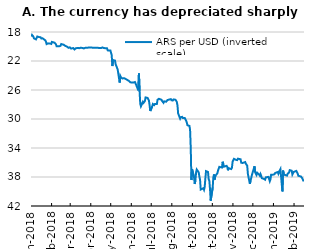
| Category | ARS per USD (inverted scale) |
|---|---|
| Jan-18 | 18.625 |
| Jan-18 | 18.4 |
| Jan-18 | 18.445 |
| Jan-18 | 18.62 |
| Jan-18 | 18.88 |
| Jan-18 | 19.02 |
| Jan-18 | 18.938 |
| Jan-18 | 18.62 |
| Jan-18 | 18.705 |
| Jan-18 | 18.685 |
| Jan-18 | 18.735 |
| Jan-18 | 18.89 |
| Jan-18 | 18.855 |
| Jan-18 | 18.871 |
| Jan-18 | 18.991 |
| Jan-18 | 19.146 |
| Jan-18 | 19.34 |
| Jan-18 | 19.661 |
| Jan-18 | 19.578 |
| Jan-18 | 19.567 |
| Jan-18 | 19.585 |
| Jan-18 | 19.632 |
| Jan-18 | 19.642 |
| Feb-18 | 19.365 |
| Feb-18 | 19.482 |
| Feb-18 | 19.475 |
| Feb-18 | 19.575 |
| Feb-18 | 19.688 |
| Feb-18 | 19.965 |
| Feb-18 | 19.97 |
| Feb-18 | 19.97 |
| Feb-18 | 19.97 |
| Feb-18 | 19.897 |
| Feb-18 | 19.66 |
| Feb-18 | 19.767 |
| Feb-18 | 19.767 |
| Feb-18 | 19.865 |
| Feb-18 | 19.912 |
| Feb-18 | 19.952 |
| Feb-18 | 19.977 |
| Feb-18 | 20.18 |
| Feb-18 | 20.23 |
| Feb-18 | 20.115 |
| Mar-18 | 20.155 |
| Mar-18 | 20.285 |
| Mar-18 | 20.21 |
| Mar-18 | 20.325 |
| Mar-18 | 20.402 |
| Mar-18 | 20.36 |
| Mar-18 | 20.245 |
| Mar-18 | 20.197 |
| Mar-18 | 20.212 |
| Mar-18 | 20.235 |
| Mar-18 | 20.33 |
| Mar-18 | 20.18 |
| Mar-18 | 20.195 |
| Mar-18 | 20.257 |
| Mar-18 | 20.269 |
| Mar-18 | 20.224 |
| Mar-18 | 20.189 |
| Mar-18 | 20.185 |
| Mar-18 | 20.169 |
| Mar-18 | 20.147 |
| Mar-18 | 20.147 |
| Mar-18 | 20.147 |
| Apr-18 | 20.147 |
| Apr-18 | 20.175 |
| Apr-18 | 20.179 |
| Apr-18 | 20.19 |
| Apr-18 | 20.17 |
| Apr-18 | 20.19 |
| Apr-18 | 20.159 |
| Apr-18 | 20.166 |
| Apr-18 | 20.207 |
| Apr-18 | 20.218 |
| Apr-18 | 20.219 |
| Apr-18 | 20.177 |
| Apr-18 | 20.13 |
| Apr-18 | 20.165 |
| Apr-18 | 20.2 |
| Apr-18 | 20.259 |
| Apr-18 | 20.259 |
| Apr-18 | 20.257 |
| Apr-18 | 20.535 |
| Apr-18 | 20.537 |
| Apr-18 | 20.537 |
| May-18 | 20.537 |
| May-18 | 21.185 |
| May-18 | 22.7 |
| May-18 | 21.865 |
| May-18 | 21.95 |
| May-18 | 22.475 |
| May-18 | 22.7 |
| May-18 | 22.7 |
| May-18 | 23.175 |
| May-18 | 24.975 |
| May-18 | 24.075 |
| May-18 | 24.275 |
| May-18 | 24.32 |
| May-18 | 24.402 |
| May-18 | 24.382 |
| May-18 | 24.287 |
| May-18 | 24.48 |
| May-18 | 24.587 |
| May-18 | 24.587 |
| May-18 | 24.745 |
| May-18 | 24.86 |
| May-18 | 24.927 |
| May-18 | 24.969 |
| Jun-18 | 24.977 |
| Jun-18 | 24.969 |
| Jun-18 | 24.955 |
| Jun-18 | 24.9 |
| Jun-18 | 24.984 |
| Jun-18 | 25.335 |
| Jun-18 | 26.045 |
| Jun-18 | 23.735 |
| Jun-18 | 26.2 |
| Jun-18 | 27.925 |
| Jun-18 | 28.25 |
| Jun-18 | 27.63 |
| Jun-18 | 27.775 |
| Jun-18 | 27.775 |
| Jun-18 | 27.505 |
| Jun-18 | 27.025 |
| Jun-18 | 27.09 |
| Jun-18 | 27.08 |
| Jun-18 | 27.435 |
| Jun-18 | 28.06 |
| Jun-18 | 28.9 |
| Jul-18 | 28.26 |
| Jul-18 | 27.935 |
| Jul-18 | 28.07 |
| Jul-18 | 28.08 |
| Jul-18 | 27.93 |
| Jul-18 | 27.93 |
| Jul-18 | 27.35 |
| Jul-18 | 27.388 |
| Jul-18 | 27.215 |
| Jul-18 | 27.245 |
| Jul-18 | 27.345 |
| Jul-18 | 27.535 |
| Jul-18 | 27.61 |
| Jul-18 | 27.765 |
| Jul-18 | 27.565 |
| Jul-18 | 27.612 |
| Jul-18 | 27.485 |
| Jul-18 | 27.385 |
| Jul-18 | 27.405 |
| Jul-18 | 27.33 |
| Jul-18 | 27.26 |
| Jul-18 | 27.415 |
| Aug-18 | 27.512 |
| Aug-18 | 27.45 |
| Aug-18 | 27.3 |
| Aug-18 | 27.345 |
| Aug-18 | 27.4 |
| Aug-18 | 27.635 |
| Aug-18 | 28.1 |
| Aug-18 | 29.225 |
| Aug-18 | 29.945 |
| Aug-18 | 29.745 |
| Aug-18 | 29.75 |
| Aug-18 | 29.705 |
| Aug-18 | 29.86 |
| Aug-18 | 29.86 |
| Aug-18 | 29.998 |
| Aug-18 | 30.23 |
| Aug-18 | 30.46 |
| Aug-18 | 30.86 |
| Aug-18 | 30.955 |
| Aug-18 | 31.47 |
| Aug-18 | 34 |
| Aug-18 | 38.425 |
| Aug-18 | 36.9 |
| Sep-18 | 38.1 |
| Sep-18 | 38.962 |
| Sep-18 | 38.46 |
| Sep-18 | 37.415 |
| Sep-18 | 36.965 |
| Sep-18 | 37.355 |
| Sep-18 | 37.95 |
| Sep-18 | 38.35 |
| Sep-18 | 39.725 |
| Sep-18 | 39.86 |
| Sep-18 | 39.55 |
| Sep-18 | 39.765 |
| Sep-18 | 39.36 |
| Sep-18 | 38.2 |
| Sep-18 | 37.19 |
| Sep-18 | 37.305 |
| Sep-18 | 38.31 |
| Sep-18 | 38.53 |
| Sep-18 | 39.65 |
| Sep-18 | 41.275 |
| Oct-18 | 39.475 |
| Oct-18 | 38.075 |
| Oct-18 | 37.645 |
| Oct-18 | 38.35 |
| Oct-18 | 37.85 |
| Oct-18 | 37.5 |
| Oct-18 | 37.13 |
| Oct-18 | 37.185 |
| Oct-18 | 36.6 |
| Oct-18 | 36.695 |
| Oct-18 | 36.695 |
| Oct-18 | 35.9 |
| Oct-18 | 36.2 |
| Oct-18 | 36.575 |
| Oct-18 | 36.53 |
| Oct-18 | 36.465 |
| Oct-18 | 36.61 |
| Oct-18 | 37.075 |
| Oct-18 | 36.775 |
| Oct-18 | 36.858 |
| Oct-18 | 36.91 |
| Oct-18 | 36.73 |
| Oct-18 | 35.9 |
| Nov-18 | 35.67 |
| Nov-18 | 35.5 |
| Nov-18 | 35.635 |
| Nov-18 | 35.635 |
| Nov-18 | 35.67 |
| Nov-18 | 35.475 |
| Nov-18 | 35.415 |
| Nov-18 | 35.55 |
| Nov-18 | 36.025 |
| Nov-18 | 35.9 |
| Nov-18 | 36.065 |
| Nov-18 | 35.94 |
| Nov-18 | 35.94 |
| Nov-18 | 36.19 |
| Nov-18 | 36.275 |
| Nov-18 | 36.43 |
| Nov-18 | 37.55 |
| Nov-18 | 38.95 |
| Nov-18 | 38.56 |
| Nov-18 | 38.465 |
| Nov-18 | 37.745 |
| Nov-18 | 37.745 |
| Dec-18 | 36.51 |
| Dec-18 | 37.375 |
| Dec-18 | 37.48 |
| Dec-18 | 37.715 |
| Dec-18 | 37.41 |
| Dec-18 | 37.68 |
| Dec-18 | 37.82 |
| Dec-18 | 37.587 |
| Dec-18 | 37.82 |
| Dec-18 | 38.165 |
| Dec-18 | 38.255 |
| Dec-18 | 38.275 |
| Dec-18 | 38.37 |
| Dec-18 | 38.045 |
| Dec-18 | 37.987 |
| Dec-18 | 37.987 |
| Dec-18 | 37.987 |
| Dec-18 | 38.585 |
| Dec-18 | 38.325 |
| Dec-18 | 37.675 |
| Dec-18 | 37.675 |
| Jan-19 | 37.675 |
| Jan-19 | 37.625 |
| Jan-19 | 37.455 |
| Jan-19 | 37.36 |
| Jan-19 | 37.31 |
| Jan-19 | 37.565 |
| Jan-19 | 37.36 |
| Jan-19 | 37.085 |
| Jan-19 | 36.905 |
| Jan-19 | 39.985 |
| Jan-19 | 37.12 |
| Jan-19 | 37.49 |
| Jan-19 | 37.695 |
| Jan-19 | 37.57 |
| Jan-19 | 37.81 |
| Jan-19 | 37.525 |
| Jan-19 | 37.555 |
| Jan-19 | 37.39 |
| Jan-19 | 37.055 |
| Jan-19 | 37.135 |
| Jan-19 | 37.66 |
| Jan-19 | 37.525 |
| Jan-19 | 37.3 |
| Feb-19 | 37.17 |
| Feb-19 | 37.16 |
| Feb-19 | 37.215 |
| Feb-19 | 37.535 |
| Feb-19 | 37.835 |
| Feb-19 | 37.83 |
| Feb-19 | 37.935 |
| Feb-19 | 37.98 |
| Feb-19 | 38.2 |
| Feb-19 | 38.207 |
| Feb-19 | 38.61 |